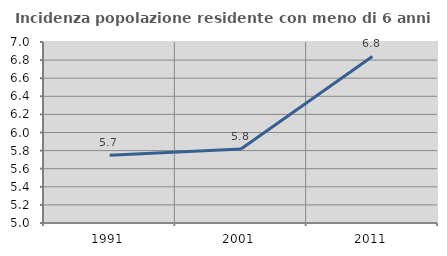
| Category | Incidenza popolazione residente con meno di 6 anni |
|---|---|
| 1991.0 | 5.749 |
| 2001.0 | 5.818 |
| 2011.0 | 6.84 |